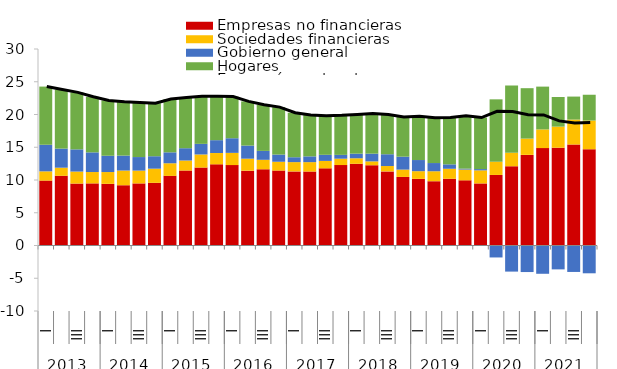
| Category | Empresas no financieras | Sociedades financieras | Gobierno general | Hogares |
|---|---|---|---|---|
| 0 | 9.907 | 1.413 | 4.059 | 8.884 |
| 1 | 10.64 | 1.239 | 2.915 | 9.016 |
| 2 | 9.457 | 1.83 | 3.39 | 8.702 |
| 3 | 9.485 | 1.731 | 3.004 | 8.482 |
| 4 | 9.413 | 1.801 | 2.489 | 8.448 |
| 5 | 9.201 | 2.243 | 2.283 | 8.221 |
| 6 | 9.48 | 1.954 | 2.069 | 8.33 |
| 7 | 9.568 | 2.162 | 1.899 | 8.08 |
| 8 | 10.63 | 1.925 | 1.669 | 8.127 |
| 9 | 11.447 | 1.528 | 1.879 | 7.743 |
| 10 | 11.898 | 2.001 | 1.618 | 7.259 |
| 11 | 12.394 | 1.724 | 1.963 | 6.697 |
| 12 | 12.277 | 1.865 | 2.236 | 6.354 |
| 13 | 11.426 | 1.831 | 1.997 | 6.748 |
| 14 | 11.637 | 1.446 | 1.36 | 7.041 |
| 15 | 11.439 | 1.346 | 1.097 | 7.245 |
| 16 | 11.311 | 1.42 | 0.746 | 6.8 |
| 17 | 11.291 | 1.436 | 0.88 | 6.318 |
| 18 | 11.776 | 1.138 | 0.932 | 5.956 |
| 19 | 12.281 | 0.974 | 0.582 | 6.038 |
| 20 | 12.476 | 0.841 | 0.705 | 5.99 |
| 21 | 12.254 | 0.59 | 1.178 | 6.146 |
| 22 | 11.315 | 0.817 | 1.8 | 6.062 |
| 23 | 10.466 | 1.122 | 1.973 | 6.073 |
| 24 | 10.169 | 1.178 | 1.702 | 6.674 |
| 25 | 9.817 | 1.518 | 1.255 | 6.927 |
| 26 | 10.189 | 1.527 | 0.672 | 7.138 |
| 27 | 9.948 | 1.644 | 0.142 | 8.091 |
| 28 | 9.476 | 1.998 | 0.192 | 7.866 |
| 29 | 10.772 | 2.015 | -1.825 | 9.528 |
| 30 | 12.099 | 2.059 | -3.985 | 10.285 |
| 31 | 13.836 | 2.485 | -4.053 | 7.696 |
| 32 | 14.869 | 2.854 | -4.317 | 6.535 |
| 33 | 14.926 | 3.223 | -3.646 | 4.525 |
| 34 | 15.42 | 3.806 | -4.037 | 3.511 |
| 35 | 14.695 | 4.382 | -4.243 | 3.938 |